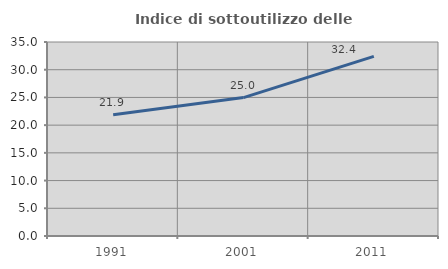
| Category | Indice di sottoutilizzo delle abitazioni  |
|---|---|
| 1991.0 | 21.884 |
| 2001.0 | 24.972 |
| 2011.0 | 32.411 |